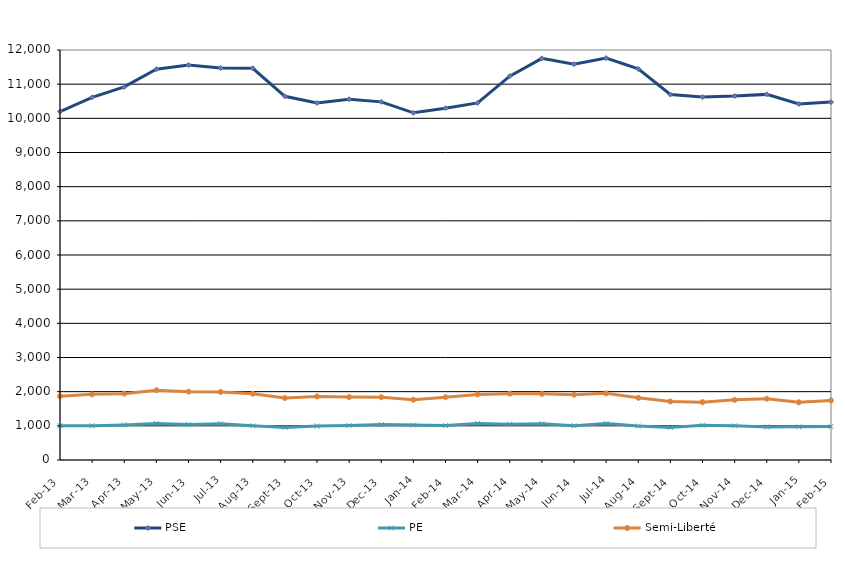
| Category | PSE | PE | Semi-Liberté |
|---|---|---|---|
| 2013-02-01 | 10197 | 1002 | 1867 |
| 2013-03-01 | 10615 | 1002 | 1921 |
| 2013-04-01 | 10919 | 1027 | 1942 |
| 2013-05-01 | 11438 | 1070 | 2041 |
| 2013-06-01 | 11559 | 1038 | 2000 |
| 2013-07-01 | 11475 | 1061 | 1993 |
| 2013-08-01 | 11465 | 999 | 1939 |
| 2013-09-01 | 10646 | 954 | 1813 |
| 2013-10-01 | 10451 | 993 | 1860 |
| 2013-11-01 | 10560 | 1013 | 1842 |
| 2013-12-01 | 10482 | 1037 | 1838 |
| 2014-01-01 | 10161 | 1022 | 1765 |
| 2014-02-01 | 10296 | 1007 | 1838 |
| 2014-03-01 | 10452 | 1071 | 1920 |
| 2014-04-01 | 11234 | 1050 | 1942 |
| 2014-05-01 | 11755 | 1062 | 1937 |
| 2014-06-01 | 11586 | 1005 | 1912 |
| 2014-07-01 | 11763 | 1068 | 1951 |
| 2014-08-01 | 11447 | 992 | 1820 |
| 2014-09-01 | 10698 | 951 | 1714 |
| 2014-10-01 | 10622 | 1018 | 1692 |
| 2014-11-01 | 10651 | 1000 | 1760 |
| 2014-12-01 | 10701 | 966 | 1794 |
| 2015-01-01 | 10419 | 970 | 1689 |
| 2015-02-01 | 10476 | 977 | 1743 |